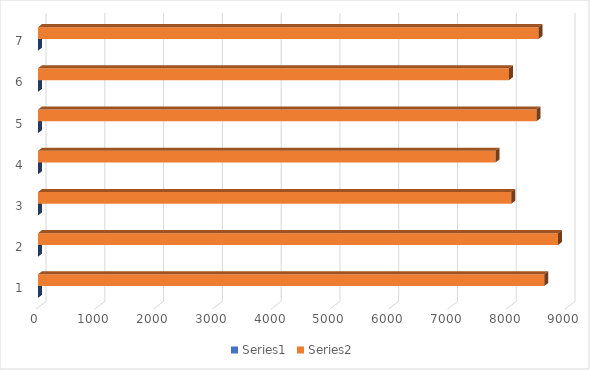
| Category | Series 0 | Series 1 |
|---|---|---|
| 0 | 0 | 8611 |
| 1 | 0 | 8848 |
| 2 | 0 | 8051 |
| 3 | 0 | 7782 |
| 4 | 0 | 8481 |
| 5 | 0 | 8013 |
| 6 | 0 | 8516 |